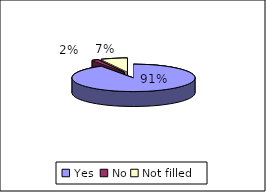
| Category | Prior to the procedure you were given an anaesthetic - did this work |
|---|---|
| Yes  | 52 |
| No | 1 |
| Not filled | 4 |